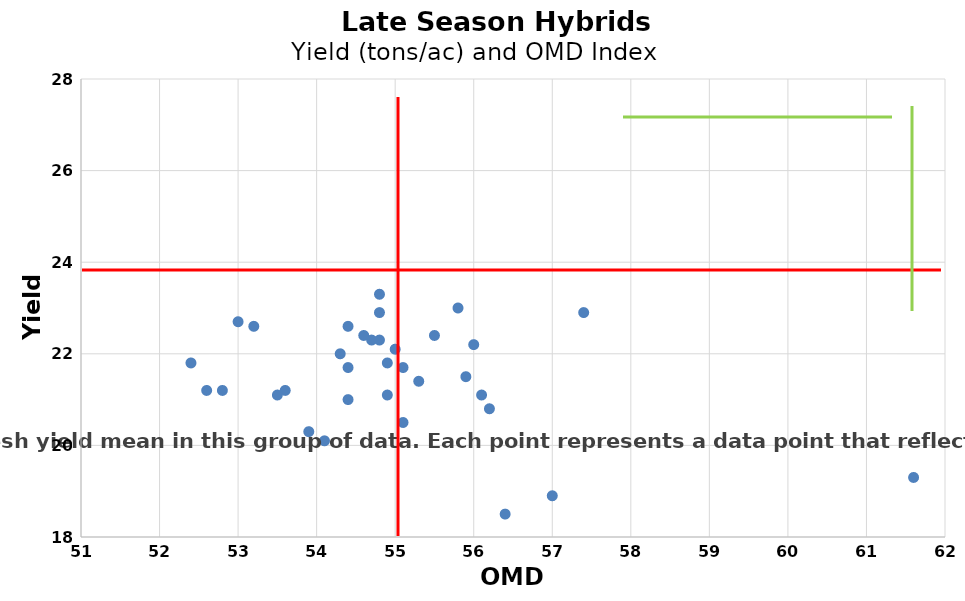
| Category | Series 0 |
|---|---|
| 53.0 | 22.7 |
| 52.8 | 21.2 |
| 53.2 | 22.6 |
| 54.4 | 22.6 |
| 55.3 | 21.4 |
| 54.8 | 22.9 |
| 54.9 | 21.1 |
| 55.5 | 22.4 |
| 54.4 | 21.7 |
| 52.6 | 21.2 |
| 54.4 | 21 |
| 54.6 | 22.4 |
| 53.5 | 21.1 |
| 55.8 | 23 |
| 57.0 | 18.9 |
| 54.3 | 22 |
| 55.1 | 21.7 |
| 55.9 | 21.5 |
| 55.0 | 22.1 |
| 54.7 | 22.3 |
| 54.1 | 20.1 |
| 54.8 | 23.3 |
| 53.6 | 21.2 |
| 57.4 | 22.9 |
| 54.8 | 22.3 |
| 52.4 | 21.8 |
| 56.0 | 22.2 |
| 53.9 | 20.3 |
| 56.1 | 21.1 |
| 54.9 | 21.8 |
| 55.1 | 20.5 |
| 56.4 | 18.5 |
| 61.6 | 19.3 |
| 56.2 | 20.8 |